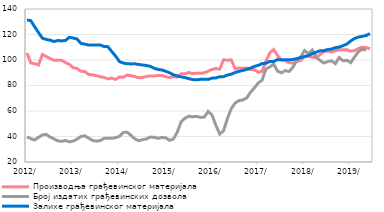
| Category | Производња грађевинског материјала |
|---|---|
| 2012-01-01 | 105.487 |
| 2012-02-01 | 97.69 |
| 2012-03-01 | 97.16 |
| 2012-04-01 | 96.046 |
| 2012-05-01 | 104.325 |
| 2012-06-01 | 102.702 |
| 2012-07-01 | 101.24 |
| 2012-08-01 | 99.748 |
| 2012-09-01 | 99.904 |
| 2012-10-01 | 99.87 |
| 2012-11-01 | 97.946 |
| 2012-12-01 | 96.578 |
| 2013-01-01 | 93.977 |
| 2013-02-01 | 93.384 |
| 2013-03-01 | 91.126 |
| 2013-04-01 | 91.027 |
| 2013-05-01 | 88.668 |
| 2013-06-01 | 88.34 |
| 2013-07-01 | 87.726 |
| 2013-08-01 | 86.868 |
| 2013-09-01 | 86.315 |
| 2013-10-01 | 85.215 |
| 2013-11-01 | 85.818 |
| 2013-12-01 | 84.776 |
| 2014-01-01 | 86.746 |
| 2014-02-01 | 86.469 |
| 2014-03-01 | 88.187 |
| 2014-04-01 | 87.678 |
| 2014-05-01 | 86.986 |
| 2014-06-01 | 86.071 |
| 2014-07-01 | 86.234 |
| 2014-08-01 | 87.132 |
| 2014-09-01 | 87.453 |
| 2014-10-01 | 87.44 |
| 2014-11-01 | 87.89 |
| 2014-12-01 | 87.875 |
| 2015-01-01 | 86.911 |
| 2015-02-01 | 86.248 |
| 2015-03-01 | 86.871 |
| 2015-04-01 | 86.686 |
| 2015-05-01 | 89.154 |
| 2015-06-01 | 89.243 |
| 2015-07-01 | 90.178 |
| 2015-08-01 | 89.284 |
| 2015-09-01 | 89.665 |
| 2015-10-01 | 89.633 |
| 2015-11-01 | 89.97 |
| 2015-12-01 | 91.235 |
| 2016-01-01 | 92.547 |
| 2016-02-01 | 93.311 |
| 2016-03-01 | 92.868 |
| 2016-04-01 | 100.186 |
| 2016-05-01 | 99.747 |
| 2016-06-01 | 100.139 |
| 2016-07-01 | 93.121 |
| 2016-08-01 | 93.711 |
| 2016-09-01 | 93.476 |
| 2016-10-01 | 93.694 |
| 2016-11-01 | 92.492 |
| 2016-12-01 | 92.407 |
| 2017-01-01 | 90.394 |
| 2017-02-01 | 91.08 |
| 2017-03-01 | 99.114 |
| 2017-04-01 | 105.589 |
| 2017-05-01 | 108.224 |
| 2017-06-01 | 103.495 |
| 2017-07-01 | 100.257 |
| 2017-08-01 | 99.399 |
| 2017-09-01 | 97.795 |
| 2017-10-01 | 97.69 |
| 2017-11-01 | 98.842 |
| 2017-12-01 | 99.596 |
| 2018-01-01 | 102.997 |
| 2018-02-01 | 103.052 |
| 2018-03-01 | 102.137 |
| 2018-04-01 | 101.786 |
| 2018-05-01 | 104.161 |
| 2018-06-01 | 106.616 |
| 2018-07-01 | 106.869 |
| 2018-08-01 | 106.369 |
| 2018-09-01 | 107.369 |
| 2018-10-31 | 107.877 |
| 2018-11-30 | 108.044 |
| 2018-12-31 | 108.065 |
| 2019-01-31 | 106.869 |
| 2019-02-28 | 107.423 |
| 2019-03-31 | 109.059 |
| 2019-04-30 | 110.087 |
| 2019-05-31 | 109.811 |
| 2019-06-30 | 108.771 |